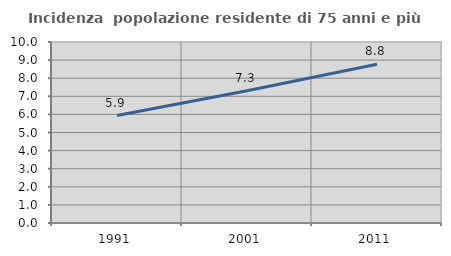
| Category | Incidenza  popolazione residente di 75 anni e più |
|---|---|
| 1991.0 | 5.937 |
| 2001.0 | 7.308 |
| 2011.0 | 8.768 |